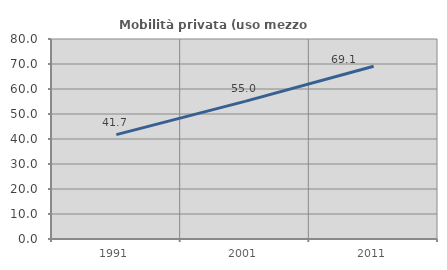
| Category | Mobilità privata (uso mezzo privato) |
|---|---|
| 1991.0 | 41.745 |
| 2001.0 | 55.031 |
| 2011.0 | 69.091 |